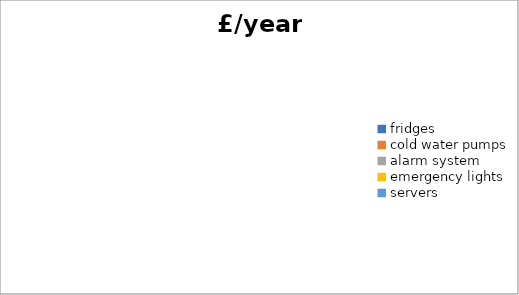
| Category | £/year |
|---|---|
| fridges | 0 |
| cold water pumps | 0 |
| alarm system | 0 |
| emergency lights | 0 |
| servers | 0 |